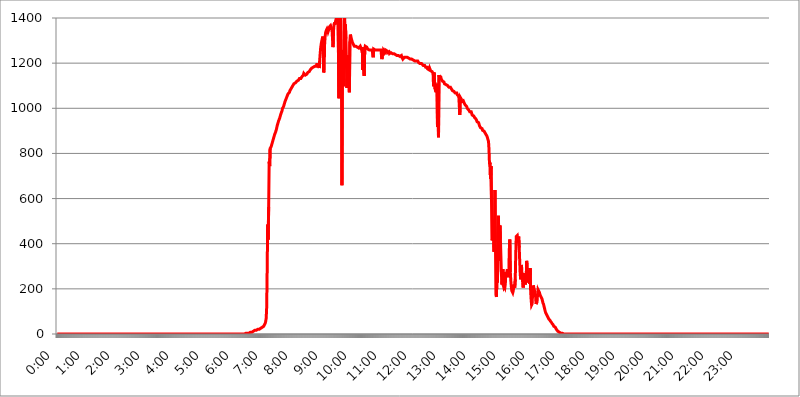
| Category | 2016.02.22. Intenzitás [W/m^2] |
|---|---|
| 0.0 | 0 |
| 0.0006944444444444445 | 0 |
| 0.001388888888888889 | 0 |
| 0.0020833333333333333 | 0 |
| 0.002777777777777778 | 0 |
| 0.003472222222222222 | 0 |
| 0.004166666666666667 | 0 |
| 0.004861111111111111 | 0 |
| 0.005555555555555556 | 0 |
| 0.0062499999999999995 | 0 |
| 0.006944444444444444 | 0 |
| 0.007638888888888889 | 0 |
| 0.008333333333333333 | 0 |
| 0.009027777777777779 | 0 |
| 0.009722222222222222 | 0 |
| 0.010416666666666666 | 0 |
| 0.011111111111111112 | 0 |
| 0.011805555555555555 | 0 |
| 0.012499999999999999 | 0 |
| 0.013194444444444444 | 0 |
| 0.013888888888888888 | 0 |
| 0.014583333333333332 | 0 |
| 0.015277777777777777 | 0 |
| 0.015972222222222224 | 0 |
| 0.016666666666666666 | 0 |
| 0.017361111111111112 | 0 |
| 0.018055555555555557 | 0 |
| 0.01875 | 0 |
| 0.019444444444444445 | 0 |
| 0.02013888888888889 | 0 |
| 0.020833333333333332 | 0 |
| 0.02152777777777778 | 0 |
| 0.022222222222222223 | 0 |
| 0.02291666666666667 | 0 |
| 0.02361111111111111 | 0 |
| 0.024305555555555556 | 0 |
| 0.024999999999999998 | 0 |
| 0.025694444444444447 | 0 |
| 0.02638888888888889 | 0 |
| 0.027083333333333334 | 0 |
| 0.027777777777777776 | 0 |
| 0.02847222222222222 | 0 |
| 0.029166666666666664 | 0 |
| 0.029861111111111113 | 0 |
| 0.030555555555555555 | 0 |
| 0.03125 | 0 |
| 0.03194444444444445 | 0 |
| 0.03263888888888889 | 0 |
| 0.03333333333333333 | 0 |
| 0.034027777777777775 | 0 |
| 0.034722222222222224 | 0 |
| 0.035416666666666666 | 0 |
| 0.036111111111111115 | 0 |
| 0.03680555555555556 | 0 |
| 0.0375 | 0 |
| 0.03819444444444444 | 0 |
| 0.03888888888888889 | 0 |
| 0.03958333333333333 | 0 |
| 0.04027777777777778 | 0 |
| 0.04097222222222222 | 0 |
| 0.041666666666666664 | 0 |
| 0.042361111111111106 | 0 |
| 0.04305555555555556 | 0 |
| 0.043750000000000004 | 0 |
| 0.044444444444444446 | 0 |
| 0.04513888888888889 | 0 |
| 0.04583333333333334 | 0 |
| 0.04652777777777778 | 0 |
| 0.04722222222222222 | 0 |
| 0.04791666666666666 | 0 |
| 0.04861111111111111 | 0 |
| 0.049305555555555554 | 0 |
| 0.049999999999999996 | 0 |
| 0.05069444444444445 | 0 |
| 0.051388888888888894 | 0 |
| 0.052083333333333336 | 0 |
| 0.05277777777777778 | 0 |
| 0.05347222222222222 | 0 |
| 0.05416666666666667 | 0 |
| 0.05486111111111111 | 0 |
| 0.05555555555555555 | 0 |
| 0.05625 | 0 |
| 0.05694444444444444 | 0 |
| 0.057638888888888885 | 0 |
| 0.05833333333333333 | 0 |
| 0.05902777777777778 | 0 |
| 0.059722222222222225 | 0 |
| 0.06041666666666667 | 0 |
| 0.061111111111111116 | 0 |
| 0.06180555555555556 | 0 |
| 0.0625 | 0 |
| 0.06319444444444444 | 0 |
| 0.06388888888888888 | 0 |
| 0.06458333333333334 | 0 |
| 0.06527777777777778 | 0 |
| 0.06597222222222222 | 0 |
| 0.06666666666666667 | 0 |
| 0.06736111111111111 | 0 |
| 0.06805555555555555 | 0 |
| 0.06874999999999999 | 0 |
| 0.06944444444444443 | 0 |
| 0.07013888888888889 | 0 |
| 0.07083333333333333 | 0 |
| 0.07152777777777779 | 0 |
| 0.07222222222222223 | 0 |
| 0.07291666666666667 | 0 |
| 0.07361111111111111 | 0 |
| 0.07430555555555556 | 0 |
| 0.075 | 0 |
| 0.07569444444444444 | 0 |
| 0.0763888888888889 | 0 |
| 0.07708333333333334 | 0 |
| 0.07777777777777778 | 0 |
| 0.07847222222222222 | 0 |
| 0.07916666666666666 | 0 |
| 0.0798611111111111 | 0 |
| 0.08055555555555556 | 0 |
| 0.08125 | 0 |
| 0.08194444444444444 | 0 |
| 0.08263888888888889 | 0 |
| 0.08333333333333333 | 0 |
| 0.08402777777777777 | 0 |
| 0.08472222222222221 | 0 |
| 0.08541666666666665 | 0 |
| 0.08611111111111112 | 0 |
| 0.08680555555555557 | 0 |
| 0.08750000000000001 | 0 |
| 0.08819444444444445 | 0 |
| 0.08888888888888889 | 0 |
| 0.08958333333333333 | 0 |
| 0.09027777777777778 | 0 |
| 0.09097222222222222 | 0 |
| 0.09166666666666667 | 0 |
| 0.09236111111111112 | 0 |
| 0.09305555555555556 | 0 |
| 0.09375 | 0 |
| 0.09444444444444444 | 0 |
| 0.09513888888888888 | 0 |
| 0.09583333333333333 | 0 |
| 0.09652777777777777 | 0 |
| 0.09722222222222222 | 0 |
| 0.09791666666666667 | 0 |
| 0.09861111111111111 | 0 |
| 0.09930555555555555 | 0 |
| 0.09999999999999999 | 0 |
| 0.10069444444444443 | 0 |
| 0.1013888888888889 | 0 |
| 0.10208333333333335 | 0 |
| 0.10277777777777779 | 0 |
| 0.10347222222222223 | 0 |
| 0.10416666666666667 | 0 |
| 0.10486111111111111 | 0 |
| 0.10555555555555556 | 0 |
| 0.10625 | 0 |
| 0.10694444444444444 | 0 |
| 0.1076388888888889 | 0 |
| 0.10833333333333334 | 0 |
| 0.10902777777777778 | 0 |
| 0.10972222222222222 | 0 |
| 0.1111111111111111 | 0 |
| 0.11180555555555556 | 0 |
| 0.11180555555555556 | 0 |
| 0.1125 | 0 |
| 0.11319444444444444 | 0 |
| 0.11388888888888889 | 0 |
| 0.11458333333333333 | 0 |
| 0.11527777777777777 | 0 |
| 0.11597222222222221 | 0 |
| 0.11666666666666665 | 0 |
| 0.1173611111111111 | 0 |
| 0.11805555555555557 | 0 |
| 0.11944444444444445 | 0 |
| 0.12013888888888889 | 0 |
| 0.12083333333333333 | 0 |
| 0.12152777777777778 | 0 |
| 0.12222222222222223 | 0 |
| 0.12291666666666667 | 0 |
| 0.12291666666666667 | 0 |
| 0.12361111111111112 | 0 |
| 0.12430555555555556 | 0 |
| 0.125 | 0 |
| 0.12569444444444444 | 0 |
| 0.12638888888888888 | 0 |
| 0.12708333333333333 | 0 |
| 0.16875 | 0 |
| 0.12847222222222224 | 0 |
| 0.12916666666666668 | 0 |
| 0.12986111111111112 | 0 |
| 0.13055555555555556 | 0 |
| 0.13125 | 0 |
| 0.13194444444444445 | 0 |
| 0.1326388888888889 | 0 |
| 0.13333333333333333 | 0 |
| 0.13402777777777777 | 0 |
| 0.13402777777777777 | 0 |
| 0.13472222222222222 | 0 |
| 0.13541666666666666 | 0 |
| 0.1361111111111111 | 0 |
| 0.13749999999999998 | 0 |
| 0.13819444444444443 | 0 |
| 0.1388888888888889 | 0 |
| 0.13958333333333334 | 0 |
| 0.14027777777777778 | 0 |
| 0.14097222222222222 | 0 |
| 0.14166666666666666 | 0 |
| 0.1423611111111111 | 0 |
| 0.14305555555555557 | 0 |
| 0.14375000000000002 | 0 |
| 0.14444444444444446 | 0 |
| 0.1451388888888889 | 0 |
| 0.1451388888888889 | 0 |
| 0.14652777777777778 | 0 |
| 0.14722222222222223 | 0 |
| 0.14791666666666667 | 0 |
| 0.1486111111111111 | 0 |
| 0.14930555555555555 | 0 |
| 0.15 | 0 |
| 0.15069444444444444 | 0 |
| 0.15138888888888888 | 0 |
| 0.15208333333333332 | 0 |
| 0.15277777777777776 | 0 |
| 0.15347222222222223 | 0 |
| 0.15416666666666667 | 0 |
| 0.15486111111111112 | 0 |
| 0.15555555555555556 | 0 |
| 0.15625 | 0 |
| 0.15694444444444444 | 0 |
| 0.15763888888888888 | 0 |
| 0.15833333333333333 | 0 |
| 0.15902777777777777 | 0 |
| 0.15972222222222224 | 0 |
| 0.16041666666666668 | 0 |
| 0.16111111111111112 | 0 |
| 0.16180555555555556 | 0 |
| 0.1625 | 0 |
| 0.16319444444444445 | 0 |
| 0.1638888888888889 | 0 |
| 0.16458333333333333 | 0 |
| 0.16527777777777777 | 0 |
| 0.16597222222222222 | 0 |
| 0.16666666666666666 | 0 |
| 0.1673611111111111 | 0 |
| 0.16805555555555554 | 0 |
| 0.16874999999999998 | 0 |
| 0.16944444444444443 | 0 |
| 0.17013888888888887 | 0 |
| 0.1708333333333333 | 0 |
| 0.17152777777777775 | 0 |
| 0.17222222222222225 | 0 |
| 0.1729166666666667 | 0 |
| 0.17361111111111113 | 0 |
| 0.17430555555555557 | 0 |
| 0.17500000000000002 | 0 |
| 0.17569444444444446 | 0 |
| 0.1763888888888889 | 0 |
| 0.17708333333333334 | 0 |
| 0.17777777777777778 | 0 |
| 0.17847222222222223 | 0 |
| 0.17916666666666667 | 0 |
| 0.1798611111111111 | 0 |
| 0.18055555555555555 | 0 |
| 0.18125 | 0 |
| 0.18194444444444444 | 0 |
| 0.1826388888888889 | 0 |
| 0.18333333333333335 | 0 |
| 0.1840277777777778 | 0 |
| 0.18472222222222223 | 0 |
| 0.18541666666666667 | 0 |
| 0.18611111111111112 | 0 |
| 0.18680555555555556 | 0 |
| 0.1875 | 0 |
| 0.18819444444444444 | 0 |
| 0.18888888888888888 | 0 |
| 0.18958333333333333 | 0 |
| 0.19027777777777777 | 0 |
| 0.1909722222222222 | 0 |
| 0.19166666666666665 | 0 |
| 0.19236111111111112 | 0 |
| 0.19305555555555554 | 0 |
| 0.19375 | 0 |
| 0.19444444444444445 | 0 |
| 0.1951388888888889 | 0 |
| 0.19583333333333333 | 0 |
| 0.19652777777777777 | 0 |
| 0.19722222222222222 | 0 |
| 0.19791666666666666 | 0 |
| 0.1986111111111111 | 0 |
| 0.19930555555555554 | 0 |
| 0.19999999999999998 | 0 |
| 0.20069444444444443 | 0 |
| 0.20138888888888887 | 0 |
| 0.2020833333333333 | 0 |
| 0.2027777777777778 | 0 |
| 0.2034722222222222 | 0 |
| 0.2041666666666667 | 0 |
| 0.20486111111111113 | 0 |
| 0.20555555555555557 | 0 |
| 0.20625000000000002 | 0 |
| 0.20694444444444446 | 0 |
| 0.2076388888888889 | 0 |
| 0.20833333333333334 | 0 |
| 0.20902777777777778 | 0 |
| 0.20972222222222223 | 0 |
| 0.21041666666666667 | 0 |
| 0.2111111111111111 | 0 |
| 0.21180555555555555 | 0 |
| 0.2125 | 0 |
| 0.21319444444444444 | 0 |
| 0.2138888888888889 | 0 |
| 0.21458333333333335 | 0 |
| 0.2152777777777778 | 0 |
| 0.21597222222222223 | 0 |
| 0.21666666666666667 | 0 |
| 0.21736111111111112 | 0 |
| 0.21805555555555556 | 0 |
| 0.21875 | 0 |
| 0.21944444444444444 | 0 |
| 0.22013888888888888 | 0 |
| 0.22083333333333333 | 0 |
| 0.22152777777777777 | 0 |
| 0.2222222222222222 | 0 |
| 0.22291666666666665 | 0 |
| 0.2236111111111111 | 0 |
| 0.22430555555555556 | 0 |
| 0.225 | 0 |
| 0.22569444444444445 | 0 |
| 0.2263888888888889 | 0 |
| 0.22708333333333333 | 0 |
| 0.22777777777777777 | 0 |
| 0.22847222222222222 | 0 |
| 0.22916666666666666 | 0 |
| 0.2298611111111111 | 0 |
| 0.23055555555555554 | 0 |
| 0.23124999999999998 | 0 |
| 0.23194444444444443 | 0 |
| 0.23263888888888887 | 0 |
| 0.2333333333333333 | 0 |
| 0.2340277777777778 | 0 |
| 0.2347222222222222 | 0 |
| 0.2354166666666667 | 0 |
| 0.23611111111111113 | 0 |
| 0.23680555555555557 | 0 |
| 0.23750000000000002 | 0 |
| 0.23819444444444446 | 0 |
| 0.2388888888888889 | 0 |
| 0.23958333333333334 | 0 |
| 0.24027777777777778 | 0 |
| 0.24097222222222223 | 0 |
| 0.24166666666666667 | 0 |
| 0.2423611111111111 | 0 |
| 0.24305555555555555 | 0 |
| 0.24375 | 0 |
| 0.24444444444444446 | 0 |
| 0.24513888888888888 | 0 |
| 0.24583333333333335 | 0 |
| 0.2465277777777778 | 0 |
| 0.24722222222222223 | 0 |
| 0.24791666666666667 | 0 |
| 0.24861111111111112 | 0 |
| 0.24930555555555556 | 0 |
| 0.25 | 0 |
| 0.25069444444444444 | 0 |
| 0.2513888888888889 | 0 |
| 0.2520833333333333 | 0 |
| 0.25277777777777777 | 0 |
| 0.2534722222222222 | 0 |
| 0.25416666666666665 | 0 |
| 0.2548611111111111 | 0 |
| 0.2555555555555556 | 0 |
| 0.25625000000000003 | 0 |
| 0.2569444444444445 | 0 |
| 0.2576388888888889 | 3.525 |
| 0.25833333333333336 | 0 |
| 0.2590277777777778 | 0 |
| 0.25972222222222224 | 0 |
| 0.2604166666666667 | 0 |
| 0.2611111111111111 | 0 |
| 0.26180555555555557 | 0 |
| 0.2625 | 0 |
| 0.26319444444444445 | 0 |
| 0.2638888888888889 | 0 |
| 0.26458333333333334 | 3.525 |
| 0.2652777777777778 | 0 |
| 0.2659722222222222 | 3.525 |
| 0.26666666666666666 | 3.525 |
| 0.2673611111111111 | 3.525 |
| 0.26805555555555555 | 3.525 |
| 0.26875 | 3.525 |
| 0.26944444444444443 | 3.525 |
| 0.2701388888888889 | 7.887 |
| 0.2708333333333333 | 7.887 |
| 0.27152777777777776 | 7.887 |
| 0.2722222222222222 | 7.887 |
| 0.27291666666666664 | 7.887 |
| 0.2736111111111111 | 12.257 |
| 0.2743055555555555 | 12.257 |
| 0.27499999999999997 | 12.257 |
| 0.27569444444444446 | 12.257 |
| 0.27638888888888885 | 12.257 |
| 0.27708333333333335 | 16.636 |
| 0.2777777777777778 | 16.636 |
| 0.27847222222222223 | 16.636 |
| 0.2791666666666667 | 16.636 |
| 0.2798611111111111 | 16.636 |
| 0.28055555555555556 | 16.636 |
| 0.28125 | 21.024 |
| 0.28194444444444444 | 21.024 |
| 0.2826388888888889 | 21.024 |
| 0.2833333333333333 | 21.024 |
| 0.28402777777777777 | 21.024 |
| 0.2847222222222222 | 21.024 |
| 0.28541666666666665 | 25.419 |
| 0.28611111111111115 | 25.419 |
| 0.28680555555555554 | 25.419 |
| 0.28750000000000003 | 29.823 |
| 0.2881944444444445 | 29.823 |
| 0.2888888888888889 | 29.823 |
| 0.28958333333333336 | 34.234 |
| 0.2902777777777778 | 34.234 |
| 0.29097222222222224 | 38.653 |
| 0.2916666666666667 | 47.511 |
| 0.2923611111111111 | 56.398 |
| 0.29305555555555557 | 69.775 |
| 0.29375 | 119.235 |
| 0.29444444444444445 | 287.709 |
| 0.2951388888888889 | 484.735 |
| 0.29583333333333334 | 418.492 |
| 0.2965277777777778 | 562.53 |
| 0.2972222222222222 | 763.674 |
| 0.29791666666666666 | 743.859 |
| 0.2986111111111111 | 822.26 |
| 0.29930555555555555 | 826.123 |
| 0.3 | 829.981 |
| 0.30069444444444443 | 837.682 |
| 0.3013888888888889 | 841.526 |
| 0.3020833333333333 | 837.682 |
| 0.30277777777777776 | 860.676 |
| 0.3034722222222222 | 864.493 |
| 0.30416666666666664 | 875.918 |
| 0.3048611111111111 | 883.516 |
| 0.3055555555555555 | 887.309 |
| 0.30624999999999997 | 894.885 |
| 0.3069444444444444 | 898.668 |
| 0.3076388888888889 | 909.996 |
| 0.30833333333333335 | 921.298 |
| 0.3090277777777778 | 928.819 |
| 0.30972222222222223 | 932.576 |
| 0.3104166666666667 | 943.832 |
| 0.3111111111111111 | 947.58 |
| 0.31180555555555556 | 955.071 |
| 0.3125 | 962.555 |
| 0.31319444444444444 | 970.034 |
| 0.3138888888888889 | 977.508 |
| 0.3145833333333333 | 981.244 |
| 0.31527777777777777 | 988.714 |
| 0.3159722222222222 | 999.916 |
| 0.31666666666666665 | 999.916 |
| 0.31736111111111115 | 1007.383 |
| 0.31805555555555554 | 1014.852 |
| 0.31875000000000003 | 1022.323 |
| 0.3194444444444445 | 1029.798 |
| 0.3201388888888889 | 1033.537 |
| 0.32083333333333336 | 1041.019 |
| 0.3215277777777778 | 1044.762 |
| 0.32222222222222224 | 1052.255 |
| 0.3229166666666667 | 1052.255 |
| 0.3236111111111111 | 1063.51 |
| 0.32430555555555557 | 1067.267 |
| 0.325 | 1067.267 |
| 0.32569444444444445 | 1071.027 |
| 0.3263888888888889 | 1078.555 |
| 0.32708333333333334 | 1082.324 |
| 0.3277777777777778 | 1086.097 |
| 0.3284722222222222 | 1089.873 |
| 0.32916666666666666 | 1093.653 |
| 0.3298611111111111 | 1097.437 |
| 0.33055555555555555 | 1101.226 |
| 0.33125 | 1101.226 |
| 0.33194444444444443 | 1108.816 |
| 0.3326388888888889 | 1108.816 |
| 0.3333333333333333 | 1112.618 |
| 0.3340277777777778 | 1112.618 |
| 0.3347222222222222 | 1116.426 |
| 0.3354166666666667 | 1116.426 |
| 0.3361111111111111 | 1120.238 |
| 0.3368055555555556 | 1120.238 |
| 0.33749999999999997 | 1120.238 |
| 0.33819444444444446 | 1124.056 |
| 0.33888888888888885 | 1124.056 |
| 0.33958333333333335 | 1131.708 |
| 0.34027777777777773 | 1131.708 |
| 0.34097222222222223 | 1131.708 |
| 0.3416666666666666 | 1131.708 |
| 0.3423611111111111 | 1135.543 |
| 0.3430555555555555 | 1139.384 |
| 0.34375 | 1135.543 |
| 0.3444444444444445 | 1143.232 |
| 0.3451388888888889 | 1147.086 |
| 0.3458333333333334 | 1154.814 |
| 0.34652777777777777 | 1154.814 |
| 0.34722222222222227 | 1150.946 |
| 0.34791666666666665 | 1147.086 |
| 0.34861111111111115 | 1147.086 |
| 0.34930555555555554 | 1150.946 |
| 0.35000000000000003 | 1150.946 |
| 0.3506944444444444 | 1154.814 |
| 0.3513888888888889 | 1158.689 |
| 0.3520833333333333 | 1158.689 |
| 0.3527777777777778 | 1162.571 |
| 0.3534722222222222 | 1162.571 |
| 0.3541666666666667 | 1166.46 |
| 0.3548611111111111 | 1170.358 |
| 0.35555555555555557 | 1170.358 |
| 0.35625 | 1174.263 |
| 0.35694444444444445 | 1178.177 |
| 0.3576388888888889 | 1182.099 |
| 0.35833333333333334 | 1178.177 |
| 0.3590277777777778 | 1182.099 |
| 0.3597222222222222 | 1182.099 |
| 0.36041666666666666 | 1182.099 |
| 0.3611111111111111 | 1186.03 |
| 0.36180555555555555 | 1186.03 |
| 0.3625 | 1186.03 |
| 0.36319444444444443 | 1186.03 |
| 0.3638888888888889 | 1193.918 |
| 0.3645833333333333 | 1193.918 |
| 0.3652777777777778 | 1193.918 |
| 0.3659722222222222 | 1193.918 |
| 0.3666666666666667 | 1193.918 |
| 0.3673611111111111 | 1178.177 |
| 0.3680555555555556 | 1209.807 |
| 0.36874999999999997 | 1242.089 |
| 0.36944444444444446 | 1266.8 |
| 0.37013888888888885 | 1283.541 |
| 0.37083333333333335 | 1296.248 |
| 0.37152777777777773 | 1304.795 |
| 0.37222222222222223 | 1317.736 |
| 0.3729166666666666 | 1300.514 |
| 0.3736111111111111 | 1158.689 |
| 0.3743055555555555 | 1166.46 |
| 0.375 | 1283.541 |
| 0.3756944444444445 | 1317.736 |
| 0.3763888888888889 | 1335.223 |
| 0.3770833333333334 | 1339.639 |
| 0.37777777777777777 | 1348.524 |
| 0.37847222222222227 | 1352.994 |
| 0.37916666666666665 | 1348.524 |
| 0.37986111111111115 | 1339.639 |
| 0.38055555555555554 | 1339.639 |
| 0.38125000000000003 | 1352.994 |
| 0.3819444444444444 | 1361.991 |
| 0.3826388888888889 | 1361.991 |
| 0.3833333333333333 | 1366.519 |
| 0.3840277777777778 | 1366.519 |
| 0.3847222222222222 | 1352.994 |
| 0.3854166666666667 | 1344.072 |
| 0.3861111111111111 | 1304.795 |
| 0.38680555555555557 | 1270.964 |
| 0.3875 | 1344.072 |
| 0.38819444444444445 | 1371.066 |
| 0.3888888888888889 | 1380.22 |
| 0.38958333333333334 | 1371.066 |
| 0.3902777777777778 | 1384.828 |
| 0.3909722222222222 | 1394.106 |
| 0.39166666666666666 | 1403.469 |
| 0.3923611111111111 | 1389.456 |
| 0.39305555555555555 | 1408.184 |
| 0.39375 | 1436.949 |
| 0.39444444444444443 | 1436.949 |
| 0.3951388888888889 | 1044.762 |
| 0.3958333333333333 | 1432.097 |
| 0.3965277777777778 | 1291.997 |
| 0.3972222222222222 | 1481.743 |
| 0.3979166666666667 | 1205.82 |
| 0.3986111111111111 | 1139.384 |
| 0.3993055555555556 | 658.909 |
| 0.39999999999999997 | 1258.511 |
| 0.40069444444444446 | 1246.176 |
| 0.40138888888888885 | 1154.814 |
| 0.40208333333333335 | 1097.437 |
| 0.40277777777777773 | 1446.727 |
| 0.40347222222222223 | 1309.093 |
| 0.4041666666666666 | 1371.066 |
| 0.4048611111111111 | 1309.093 |
| 0.4055555555555555 | 1309.093 |
| 0.40625 | 1089.873 |
| 0.4069444444444445 | 1182.099 |
| 0.4076388888888889 | 1233.951 |
| 0.4083333333333334 | 1174.263 |
| 0.40902777777777777 | 1233.951 |
| 0.40972222222222227 | 1071.027 |
| 0.41041666666666665 | 1296.248 |
| 0.41111111111111115 | 1326.445 |
| 0.41180555555555554 | 1317.736 |
| 0.41250000000000003 | 1309.093 |
| 0.4131944444444444 | 1300.514 |
| 0.4138888888888889 | 1291.997 |
| 0.4145833333333333 | 1287.761 |
| 0.4152777777777778 | 1283.541 |
| 0.4159722222222222 | 1279.334 |
| 0.4166666666666667 | 1275.142 |
| 0.4173611111111111 | 1275.142 |
| 0.41805555555555557 | 1275.142 |
| 0.41875 | 1275.142 |
| 0.41944444444444445 | 1275.142 |
| 0.4201388888888889 | 1270.964 |
| 0.42083333333333334 | 1270.964 |
| 0.4215277777777778 | 1270.964 |
| 0.4222222222222222 | 1270.964 |
| 0.42291666666666666 | 1266.8 |
| 0.4236111111111111 | 1270.964 |
| 0.42430555555555555 | 1270.964 |
| 0.425 | 1275.142 |
| 0.42569444444444443 | 1275.142 |
| 0.4263888888888889 | 1270.964 |
| 0.4270833333333333 | 1258.511 |
| 0.4277777777777778 | 1270.964 |
| 0.4284722222222222 | 1170.358 |
| 0.4291666666666667 | 1209.807 |
| 0.4298611111111111 | 1205.82 |
| 0.4305555555555556 | 1143.232 |
| 0.43124999999999997 | 1262.649 |
| 0.43194444444444446 | 1275.142 |
| 0.43263888888888885 | 1275.142 |
| 0.43333333333333335 | 1279.334 |
| 0.43402777777777773 | 1270.964 |
| 0.43472222222222223 | 1266.8 |
| 0.4354166666666666 | 1262.649 |
| 0.4361111111111111 | 1258.511 |
| 0.4368055555555555 | 1258.511 |
| 0.4375 | 1258.511 |
| 0.4381944444444445 | 1254.387 |
| 0.4388888888888889 | 1258.511 |
| 0.4395833333333334 | 1258.511 |
| 0.44027777777777777 | 1258.511 |
| 0.44097222222222227 | 1258.511 |
| 0.44166666666666665 | 1258.511 |
| 0.44236111111111115 | 1258.511 |
| 0.44305555555555554 | 1225.859 |
| 0.44375000000000003 | 1262.649 |
| 0.4444444444444444 | 1258.511 |
| 0.4451388888888889 | 1258.511 |
| 0.4458333333333333 | 1258.511 |
| 0.4465277777777778 | 1258.511 |
| 0.4472222222222222 | 1258.511 |
| 0.4479166666666667 | 1258.511 |
| 0.4486111111111111 | 1258.511 |
| 0.44930555555555557 | 1258.511 |
| 0.45 | 1258.511 |
| 0.45069444444444445 | 1258.511 |
| 0.4513888888888889 | 1258.511 |
| 0.45208333333333334 | 1258.511 |
| 0.4527777777777778 | 1262.649 |
| 0.4534722222222222 | 1258.511 |
| 0.45416666666666666 | 1258.511 |
| 0.4548611111111111 | 1225.859 |
| 0.45555555555555555 | 1217.812 |
| 0.45625 | 1250.275 |
| 0.45694444444444443 | 1233.951 |
| 0.4576388888888889 | 1258.511 |
| 0.4583333333333333 | 1258.511 |
| 0.4590277777777778 | 1258.511 |
| 0.4597222222222222 | 1250.275 |
| 0.4604166666666667 | 1258.511 |
| 0.4611111111111111 | 1254.387 |
| 0.4618055555555556 | 1254.387 |
| 0.46249999999999997 | 1254.387 |
| 0.46319444444444446 | 1246.176 |
| 0.46388888888888885 | 1246.176 |
| 0.46458333333333335 | 1246.176 |
| 0.46527777777777773 | 1250.275 |
| 0.46597222222222223 | 1242.089 |
| 0.4666666666666666 | 1242.089 |
| 0.4673611111111111 | 1246.176 |
| 0.4680555555555555 | 1246.176 |
| 0.46875 | 1242.089 |
| 0.4694444444444445 | 1242.089 |
| 0.4701388888888889 | 1242.089 |
| 0.4708333333333334 | 1242.089 |
| 0.47152777777777777 | 1242.089 |
| 0.47222222222222227 | 1242.089 |
| 0.47291666666666665 | 1238.014 |
| 0.47361111111111115 | 1238.014 |
| 0.47430555555555554 | 1238.014 |
| 0.47500000000000003 | 1238.014 |
| 0.4756944444444444 | 1233.951 |
| 0.4763888888888889 | 1233.951 |
| 0.4770833333333333 | 1233.951 |
| 0.4777777777777778 | 1233.951 |
| 0.4784722222222222 | 1233.951 |
| 0.4791666666666667 | 1233.951 |
| 0.4798611111111111 | 1233.951 |
| 0.48055555555555557 | 1229.899 |
| 0.48125 | 1229.899 |
| 0.48194444444444445 | 1229.899 |
| 0.4826388888888889 | 1233.951 |
| 0.48333333333333334 | 1225.859 |
| 0.4840277777777778 | 1225.859 |
| 0.4847222222222222 | 1217.812 |
| 0.48541666666666666 | 1221.83 |
| 0.4861111111111111 | 1217.812 |
| 0.48680555555555555 | 1225.859 |
| 0.4875 | 1225.859 |
| 0.48819444444444443 | 1221.83 |
| 0.4888888888888889 | 1225.859 |
| 0.4895833333333333 | 1225.859 |
| 0.4902777777777778 | 1225.859 |
| 0.4909722222222222 | 1225.859 |
| 0.4916666666666667 | 1221.83 |
| 0.4923611111111111 | 1221.83 |
| 0.4930555555555556 | 1221.83 |
| 0.49374999999999997 | 1221.83 |
| 0.49444444444444446 | 1221.83 |
| 0.49513888888888885 | 1217.812 |
| 0.49583333333333335 | 1217.812 |
| 0.49652777777777773 | 1217.812 |
| 0.49722222222222223 | 1217.812 |
| 0.4979166666666666 | 1217.812 |
| 0.4986111111111111 | 1213.804 |
| 0.4993055555555555 | 1213.804 |
| 0.5 | 1213.804 |
| 0.5006944444444444 | 1213.804 |
| 0.5013888888888889 | 1209.807 |
| 0.5020833333333333 | 1209.807 |
| 0.5027777777777778 | 1209.807 |
| 0.5034722222222222 | 1209.807 |
| 0.5041666666666667 | 1209.807 |
| 0.5048611111111111 | 1209.807 |
| 0.5055555555555555 | 1209.807 |
| 0.50625 | 1205.82 |
| 0.5069444444444444 | 1201.843 |
| 0.5076388888888889 | 1201.843 |
| 0.5083333333333333 | 1201.843 |
| 0.5090277777777777 | 1197.876 |
| 0.5097222222222222 | 1197.876 |
| 0.5104166666666666 | 1193.918 |
| 0.5111111111111112 | 1197.876 |
| 0.5118055555555555 | 1197.876 |
| 0.5125000000000001 | 1193.918 |
| 0.5131944444444444 | 1189.969 |
| 0.513888888888889 | 1193.918 |
| 0.5145833333333333 | 1189.969 |
| 0.5152777777777778 | 1189.969 |
| 0.5159722222222222 | 1186.03 |
| 0.5166666666666667 | 1182.099 |
| 0.517361111111111 | 1178.177 |
| 0.5180555555555556 | 1186.03 |
| 0.5187499999999999 | 1182.099 |
| 0.5194444444444445 | 1174.263 |
| 0.5201388888888888 | 1174.263 |
| 0.5208333333333334 | 1174.263 |
| 0.5215277777777778 | 1170.358 |
| 0.5222222222222223 | 1178.177 |
| 0.5229166666666667 | 1174.263 |
| 0.5236111111111111 | 1166.46 |
| 0.5243055555555556 | 1170.358 |
| 0.525 | 1170.358 |
| 0.5256944444444445 | 1162.571 |
| 0.5263888888888889 | 1166.46 |
| 0.5270833333333333 | 1154.814 |
| 0.5277777777777778 | 1097.437 |
| 0.5284722222222222 | 1158.689 |
| 0.5291666666666667 | 1158.689 |
| 0.5298611111111111 | 1086.097 |
| 0.5305555555555556 | 1078.555 |
| 0.53125 | 1071.027 |
| 0.5319444444444444 | 1074.789 |
| 0.5326388888888889 | 1108.816 |
| 0.5333333333333333 | 917.534 |
| 0.5340277777777778 | 1014.852 |
| 0.5347222222222222 | 872.114 |
| 0.5354166666666667 | 1147.086 |
| 0.5361111111111111 | 1150.946 |
| 0.5368055555555555 | 1127.879 |
| 0.5375 | 1143.232 |
| 0.5381944444444444 | 1131.708 |
| 0.5388888888888889 | 1127.879 |
| 0.5395833333333333 | 1127.879 |
| 0.5402777777777777 | 1120.238 |
| 0.5409722222222222 | 1120.238 |
| 0.5416666666666666 | 1116.426 |
| 0.5423611111111112 | 1116.426 |
| 0.5430555555555555 | 1108.816 |
| 0.5437500000000001 | 1108.816 |
| 0.5444444444444444 | 1112.618 |
| 0.545138888888889 | 1105.019 |
| 0.5458333333333333 | 1108.816 |
| 0.5465277777777778 | 1101.226 |
| 0.5472222222222222 | 1101.226 |
| 0.5479166666666667 | 1101.226 |
| 0.548611111111111 | 1097.437 |
| 0.5493055555555556 | 1093.653 |
| 0.5499999999999999 | 1089.873 |
| 0.5506944444444445 | 1093.653 |
| 0.5513888888888888 | 1093.653 |
| 0.5520833333333334 | 1089.873 |
| 0.5527777777777778 | 1086.097 |
| 0.5534722222222223 | 1082.324 |
| 0.5541666666666667 | 1078.555 |
| 0.5548611111111111 | 1078.555 |
| 0.5555555555555556 | 1078.555 |
| 0.55625 | 1074.789 |
| 0.5569444444444445 | 1074.789 |
| 0.5576388888888889 | 1074.789 |
| 0.5583333333333333 | 1067.267 |
| 0.5590277777777778 | 1067.267 |
| 0.5597222222222222 | 1063.51 |
| 0.5604166666666667 | 1067.267 |
| 0.5611111111111111 | 1059.756 |
| 0.5618055555555556 | 1059.756 |
| 0.5625 | 1059.756 |
| 0.5631944444444444 | 1052.255 |
| 0.5638888888888889 | 1052.255 |
| 0.5645833333333333 | 970.034 |
| 0.5652777777777778 | 1048.508 |
| 0.5659722222222222 | 1052.255 |
| 0.5666666666666667 | 1041.019 |
| 0.5673611111111111 | 1029.798 |
| 0.5680555555555555 | 1033.537 |
| 0.56875 | 1029.798 |
| 0.5694444444444444 | 1033.537 |
| 0.5701388888888889 | 1029.798 |
| 0.5708333333333333 | 1022.323 |
| 0.5715277777777777 | 1018.587 |
| 0.5722222222222222 | 1014.852 |
| 0.5729166666666666 | 1011.118 |
| 0.5736111111111112 | 1011.118 |
| 0.5743055555555555 | 1007.383 |
| 0.5750000000000001 | 999.916 |
| 0.5756944444444444 | 999.916 |
| 0.576388888888889 | 996.182 |
| 0.5770833333333333 | 992.448 |
| 0.5777777777777778 | 992.448 |
| 0.5784722222222222 | 984.98 |
| 0.5791666666666667 | 988.714 |
| 0.579861111111111 | 988.714 |
| 0.5805555555555556 | 984.98 |
| 0.5812499999999999 | 977.508 |
| 0.5819444444444445 | 970.034 |
| 0.5826388888888888 | 970.034 |
| 0.5833333333333334 | 970.034 |
| 0.5840277777777778 | 966.295 |
| 0.5847222222222223 | 962.555 |
| 0.5854166666666667 | 958.814 |
| 0.5861111111111111 | 958.814 |
| 0.5868055555555556 | 955.071 |
| 0.5875 | 951.327 |
| 0.5881944444444445 | 947.58 |
| 0.5888888888888889 | 940.082 |
| 0.5895833333333333 | 940.082 |
| 0.5902777777777778 | 936.33 |
| 0.5909722222222222 | 936.33 |
| 0.5916666666666667 | 932.576 |
| 0.5923611111111111 | 921.298 |
| 0.5930555555555556 | 917.534 |
| 0.59375 | 913.766 |
| 0.5944444444444444 | 909.996 |
| 0.5951388888888889 | 909.996 |
| 0.5958333333333333 | 909.996 |
| 0.5965277777777778 | 902.447 |
| 0.5972222222222222 | 898.668 |
| 0.5979166666666667 | 902.447 |
| 0.5986111111111111 | 898.668 |
| 0.5993055555555555 | 894.885 |
| 0.6 | 891.099 |
| 0.6006944444444444 | 887.309 |
| 0.6013888888888889 | 883.516 |
| 0.6020833333333333 | 879.719 |
| 0.6027777777777777 | 875.918 |
| 0.6034722222222222 | 868.305 |
| 0.6041666666666666 | 860.676 |
| 0.6048611111111112 | 853.029 |
| 0.6055555555555555 | 818.392 |
| 0.6062500000000001 | 751.803 |
| 0.6069444444444444 | 759.723 |
| 0.607638888888889 | 687.544 |
| 0.6083333333333333 | 743.859 |
| 0.6090277777777778 | 596.45 |
| 0.6097222222222222 | 414.035 |
| 0.6104166666666667 | 418.492 |
| 0.611111111111111 | 506.542 |
| 0.6118055555555556 | 480.356 |
| 0.6124999999999999 | 364.728 |
| 0.6131944444444445 | 484.735 |
| 0.6138888888888888 | 638.256 |
| 0.6145833333333334 | 405.108 |
| 0.6152777777777778 | 173.709 |
| 0.6159722222222223 | 164.605 |
| 0.6166666666666667 | 251.251 |
| 0.6173611111111111 | 228.436 |
| 0.6180555555555556 | 342.162 |
| 0.61875 | 523.88 |
| 0.6194444444444445 | 378.224 |
| 0.6201388888888889 | 324.052 |
| 0.6208333333333333 | 480.356 |
| 0.6215277777777778 | 422.943 |
| 0.6222222222222222 | 346.682 |
| 0.6229166666666667 | 269.49 |
| 0.6236111111111111 | 219.309 |
| 0.6243055555555556 | 246.689 |
| 0.625 | 287.709 |
| 0.6256944444444444 | 214.746 |
| 0.6263888888888889 | 205.62 |
| 0.6270833333333333 | 210.182 |
| 0.6277777777777778 | 205.62 |
| 0.6284722222222222 | 223.873 |
| 0.6291666666666667 | 274.047 |
| 0.6298611111111111 | 264.932 |
| 0.6305555555555555 | 274.047 |
| 0.63125 | 287.709 |
| 0.6319444444444444 | 278.603 |
| 0.6326388888888889 | 251.251 |
| 0.6333333333333333 | 269.49 |
| 0.6340277777777777 | 373.729 |
| 0.6347222222222222 | 418.492 |
| 0.6354166666666666 | 274.047 |
| 0.6361111111111112 | 237.564 |
| 0.6368055555555555 | 210.182 |
| 0.6375000000000001 | 191.937 |
| 0.6381944444444444 | 187.378 |
| 0.638888888888889 | 182.82 |
| 0.6395833333333333 | 191.937 |
| 0.6402777777777778 | 210.182 |
| 0.6409722222222222 | 219.309 |
| 0.6416666666666667 | 205.62 |
| 0.642361111111111 | 242.127 |
| 0.6430555555555556 | 351.198 |
| 0.6437499999999999 | 431.833 |
| 0.6444444444444445 | 431.833 |
| 0.6451388888888888 | 436.27 |
| 0.6458333333333334 | 405.108 |
| 0.6465277777777778 | 414.035 |
| 0.6472222222222223 | 431.833 |
| 0.6479166666666667 | 382.715 |
| 0.6486111111111111 | 324.052 |
| 0.6493055555555556 | 264.932 |
| 0.65 | 242.127 |
| 0.6506944444444445 | 305.898 |
| 0.6513888888888889 | 292.259 |
| 0.6520833333333333 | 246.689 |
| 0.6527777777777778 | 228.436 |
| 0.6534722222222222 | 205.62 |
| 0.6541666666666667 | 251.251 |
| 0.6548611111111111 | 269.49 |
| 0.6555555555555556 | 246.689 |
| 0.65625 | 219.309 |
| 0.6569444444444444 | 228.436 |
| 0.6576388888888889 | 237.564 |
| 0.6583333333333333 | 324.052 |
| 0.6590277777777778 | 305.898 |
| 0.6597222222222222 | 260.373 |
| 0.6604166666666667 | 228.436 |
| 0.6611111111111111 | 260.373 |
| 0.6618055555555555 | 278.603 |
| 0.6625 | 223.873 |
| 0.6631944444444444 | 292.259 |
| 0.6638888888888889 | 196.497 |
| 0.6645833333333333 | 155.509 |
| 0.6652777777777777 | 128.284 |
| 0.6659722222222222 | 132.814 |
| 0.6666666666666666 | 173.709 |
| 0.6673611111111111 | 214.746 |
| 0.6680555555555556 | 210.182 |
| 0.6687500000000001 | 201.058 |
| 0.6694444444444444 | 191.937 |
| 0.6701388888888888 | 173.709 |
| 0.6708333333333334 | 169.156 |
| 0.6715277777777778 | 132.814 |
| 0.6722222222222222 | 137.347 |
| 0.6729166666666666 | 141.884 |
| 0.6736111111111112 | 173.709 |
| 0.6743055555555556 | 196.497 |
| 0.6749999999999999 | 191.937 |
| 0.6756944444444444 | 187.378 |
| 0.6763888888888889 | 182.82 |
| 0.6770833333333334 | 173.709 |
| 0.6777777777777777 | 173.709 |
| 0.6784722222222223 | 164.605 |
| 0.6791666666666667 | 164.605 |
| 0.6798611111111111 | 155.509 |
| 0.6805555555555555 | 146.423 |
| 0.68125 | 137.347 |
| 0.6819444444444445 | 132.814 |
| 0.6826388888888889 | 123.758 |
| 0.6833333333333332 | 114.716 |
| 0.6840277777777778 | 105.69 |
| 0.6847222222222222 | 96.682 |
| 0.6854166666666667 | 92.184 |
| 0.686111111111111 | 87.692 |
| 0.6868055555555556 | 83.205 |
| 0.6875 | 83.205 |
| 0.6881944444444444 | 74.246 |
| 0.688888888888889 | 74.246 |
| 0.6895833333333333 | 65.31 |
| 0.6902777777777778 | 65.31 |
| 0.6909722222222222 | 60.85 |
| 0.6916666666666668 | 56.398 |
| 0.6923611111111111 | 56.398 |
| 0.6930555555555555 | 51.951 |
| 0.69375 | 47.511 |
| 0.6944444444444445 | 47.511 |
| 0.6951388888888889 | 43.079 |
| 0.6958333333333333 | 38.653 |
| 0.6965277777777777 | 34.234 |
| 0.6972222222222223 | 34.234 |
| 0.6979166666666666 | 29.823 |
| 0.6986111111111111 | 29.823 |
| 0.6993055555555556 | 25.419 |
| 0.7000000000000001 | 21.024 |
| 0.7006944444444444 | 21.024 |
| 0.7013888888888888 | 16.636 |
| 0.7020833333333334 | 12.257 |
| 0.7027777777777778 | 12.257 |
| 0.7034722222222222 | 7.887 |
| 0.7041666666666666 | 7.887 |
| 0.7048611111111112 | 3.525 |
| 0.7055555555555556 | 3.525 |
| 0.7062499999999999 | 3.525 |
| 0.7069444444444444 | 3.525 |
| 0.7076388888888889 | 3.525 |
| 0.7083333333333334 | 3.525 |
| 0.7090277777777777 | 3.525 |
| 0.7097222222222223 | 0 |
| 0.7104166666666667 | 0 |
| 0.7111111111111111 | 0 |
| 0.7118055555555555 | 0 |
| 0.7125 | 0 |
| 0.7131944444444445 | 0 |
| 0.7138888888888889 | 0 |
| 0.7145833333333332 | 0 |
| 0.7152777777777778 | 0 |
| 0.7159722222222222 | 0 |
| 0.7166666666666667 | 0 |
| 0.717361111111111 | 0 |
| 0.7180555555555556 | 0 |
| 0.71875 | 0 |
| 0.7194444444444444 | 0 |
| 0.720138888888889 | 0 |
| 0.7208333333333333 | 0 |
| 0.7215277777777778 | 0 |
| 0.7222222222222222 | 0 |
| 0.7229166666666668 | 0 |
| 0.7236111111111111 | 0 |
| 0.7243055555555555 | 0 |
| 0.725 | 0 |
| 0.7256944444444445 | 0 |
| 0.7263888888888889 | 0 |
| 0.7270833333333333 | 0 |
| 0.7277777777777777 | 0 |
| 0.7284722222222223 | 0 |
| 0.7291666666666666 | 0 |
| 0.7298611111111111 | 0 |
| 0.7305555555555556 | 0 |
| 0.7312500000000001 | 0 |
| 0.7319444444444444 | 0 |
| 0.7326388888888888 | 0 |
| 0.7333333333333334 | 0 |
| 0.7340277777777778 | 0 |
| 0.7347222222222222 | 0 |
| 0.7354166666666666 | 0 |
| 0.7361111111111112 | 0 |
| 0.7368055555555556 | 0 |
| 0.7374999999999999 | 0 |
| 0.7381944444444444 | 0 |
| 0.7388888888888889 | 0 |
| 0.7395833333333334 | 0 |
| 0.7402777777777777 | 0 |
| 0.7409722222222223 | 0 |
| 0.7416666666666667 | 0 |
| 0.7423611111111111 | 0 |
| 0.7430555555555555 | 0 |
| 0.74375 | 0 |
| 0.7444444444444445 | 0 |
| 0.7451388888888889 | 0 |
| 0.7458333333333332 | 0 |
| 0.7465277777777778 | 0 |
| 0.7472222222222222 | 0 |
| 0.7479166666666667 | 0 |
| 0.748611111111111 | 0 |
| 0.7493055555555556 | 0 |
| 0.75 | 0 |
| 0.7506944444444444 | 0 |
| 0.751388888888889 | 0 |
| 0.7520833333333333 | 0 |
| 0.7527777777777778 | 0 |
| 0.7534722222222222 | 0 |
| 0.7541666666666668 | 0 |
| 0.7548611111111111 | 0 |
| 0.7555555555555555 | 0 |
| 0.75625 | 0 |
| 0.7569444444444445 | 0 |
| 0.7576388888888889 | 0 |
| 0.7583333333333333 | 0 |
| 0.7590277777777777 | 0 |
| 0.7597222222222223 | 0 |
| 0.7604166666666666 | 0 |
| 0.7611111111111111 | 0 |
| 0.7618055555555556 | 0 |
| 0.7625000000000001 | 0 |
| 0.7631944444444444 | 0 |
| 0.7638888888888888 | 0 |
| 0.7645833333333334 | 0 |
| 0.7652777777777778 | 0 |
| 0.7659722222222222 | 0 |
| 0.7666666666666666 | 0 |
| 0.7673611111111112 | 0 |
| 0.7680555555555556 | 0 |
| 0.7687499999999999 | 0 |
| 0.7694444444444444 | 0 |
| 0.7701388888888889 | 0 |
| 0.7708333333333334 | 0 |
| 0.7715277777777777 | 0 |
| 0.7722222222222223 | 0 |
| 0.7729166666666667 | 0 |
| 0.7736111111111111 | 0 |
| 0.7743055555555555 | 0 |
| 0.775 | 0 |
| 0.7756944444444445 | 0 |
| 0.7763888888888889 | 0 |
| 0.7770833333333332 | 0 |
| 0.7777777777777778 | 0 |
| 0.7784722222222222 | 0 |
| 0.7791666666666667 | 0 |
| 0.779861111111111 | 0 |
| 0.7805555555555556 | 0 |
| 0.78125 | 0 |
| 0.7819444444444444 | 0 |
| 0.782638888888889 | 0 |
| 0.7833333333333333 | 0 |
| 0.7840277777777778 | 0 |
| 0.7847222222222222 | 0 |
| 0.7854166666666668 | 0 |
| 0.7861111111111111 | 0 |
| 0.7868055555555555 | 0 |
| 0.7875 | 0 |
| 0.7881944444444445 | 0 |
| 0.7888888888888889 | 0 |
| 0.7895833333333333 | 0 |
| 0.7902777777777777 | 0 |
| 0.7909722222222223 | 0 |
| 0.7916666666666666 | 0 |
| 0.7923611111111111 | 0 |
| 0.7930555555555556 | 0 |
| 0.7937500000000001 | 0 |
| 0.7944444444444444 | 0 |
| 0.7951388888888888 | 0 |
| 0.7958333333333334 | 0 |
| 0.7965277777777778 | 0 |
| 0.7972222222222222 | 0 |
| 0.7979166666666666 | 0 |
| 0.7986111111111112 | 0 |
| 0.7993055555555556 | 0 |
| 0.7999999999999999 | 0 |
| 0.8006944444444444 | 0 |
| 0.8013888888888889 | 0 |
| 0.8020833333333334 | 0 |
| 0.8027777777777777 | 0 |
| 0.8034722222222223 | 0 |
| 0.8041666666666667 | 0 |
| 0.8048611111111111 | 0 |
| 0.8055555555555555 | 0 |
| 0.80625 | 0 |
| 0.8069444444444445 | 0 |
| 0.8076388888888889 | 0 |
| 0.8083333333333332 | 0 |
| 0.8090277777777778 | 0 |
| 0.8097222222222222 | 0 |
| 0.8104166666666667 | 0 |
| 0.811111111111111 | 0 |
| 0.8118055555555556 | 0 |
| 0.8125 | 0 |
| 0.8131944444444444 | 0 |
| 0.813888888888889 | 0 |
| 0.8145833333333333 | 0 |
| 0.8152777777777778 | 0 |
| 0.8159722222222222 | 0 |
| 0.8166666666666668 | 0 |
| 0.8173611111111111 | 0 |
| 0.8180555555555555 | 0 |
| 0.81875 | 0 |
| 0.8194444444444445 | 0 |
| 0.8201388888888889 | 0 |
| 0.8208333333333333 | 0 |
| 0.8215277777777777 | 0 |
| 0.8222222222222223 | 0 |
| 0.8229166666666666 | 0 |
| 0.8236111111111111 | 0 |
| 0.8243055555555556 | 0 |
| 0.8250000000000001 | 0 |
| 0.8256944444444444 | 0 |
| 0.8263888888888888 | 0 |
| 0.8270833333333334 | 0 |
| 0.8277777777777778 | 0 |
| 0.8284722222222222 | 0 |
| 0.8291666666666666 | 0 |
| 0.8298611111111112 | 0 |
| 0.8305555555555556 | 0 |
| 0.8312499999999999 | 0 |
| 0.8319444444444444 | 0 |
| 0.8326388888888889 | 0 |
| 0.8333333333333334 | 0 |
| 0.8340277777777777 | 0 |
| 0.8347222222222223 | 0 |
| 0.8354166666666667 | 0 |
| 0.8361111111111111 | 0 |
| 0.8368055555555555 | 0 |
| 0.8375 | 0 |
| 0.8381944444444445 | 0 |
| 0.8388888888888889 | 0 |
| 0.8395833333333332 | 0 |
| 0.8402777777777778 | 0 |
| 0.8409722222222222 | 0 |
| 0.8416666666666667 | 0 |
| 0.842361111111111 | 0 |
| 0.8430555555555556 | 0 |
| 0.84375 | 0 |
| 0.8444444444444444 | 0 |
| 0.845138888888889 | 0 |
| 0.8458333333333333 | 0 |
| 0.8465277777777778 | 0 |
| 0.8472222222222222 | 0 |
| 0.8479166666666668 | 0 |
| 0.8486111111111111 | 0 |
| 0.8493055555555555 | 0 |
| 0.85 | 0 |
| 0.8506944444444445 | 0 |
| 0.8513888888888889 | 0 |
| 0.8520833333333333 | 0 |
| 0.8527777777777777 | 0 |
| 0.8534722222222223 | 0 |
| 0.8541666666666666 | 0 |
| 0.8548611111111111 | 0 |
| 0.8555555555555556 | 0 |
| 0.8562500000000001 | 0 |
| 0.8569444444444444 | 0 |
| 0.8576388888888888 | 0 |
| 0.8583333333333334 | 0 |
| 0.8590277777777778 | 0 |
| 0.8597222222222222 | 0 |
| 0.8604166666666666 | 0 |
| 0.8611111111111112 | 0 |
| 0.8618055555555556 | 0 |
| 0.8624999999999999 | 0 |
| 0.8631944444444444 | 0 |
| 0.8638888888888889 | 0 |
| 0.8645833333333334 | 0 |
| 0.8652777777777777 | 0 |
| 0.8659722222222223 | 0 |
| 0.8666666666666667 | 0 |
| 0.8673611111111111 | 0 |
| 0.8680555555555555 | 0 |
| 0.86875 | 0 |
| 0.8694444444444445 | 0 |
| 0.8701388888888889 | 0 |
| 0.8708333333333332 | 0 |
| 0.8715277777777778 | 0 |
| 0.8722222222222222 | 0 |
| 0.8729166666666667 | 0 |
| 0.873611111111111 | 0 |
| 0.8743055555555556 | 0 |
| 0.875 | 0 |
| 0.8756944444444444 | 0 |
| 0.876388888888889 | 0 |
| 0.8770833333333333 | 0 |
| 0.8777777777777778 | 0 |
| 0.8784722222222222 | 0 |
| 0.8791666666666668 | 0 |
| 0.8798611111111111 | 0 |
| 0.8805555555555555 | 0 |
| 0.88125 | 0 |
| 0.8819444444444445 | 0 |
| 0.8826388888888889 | 0 |
| 0.8833333333333333 | 0 |
| 0.8840277777777777 | 0 |
| 0.8847222222222223 | 0 |
| 0.8854166666666666 | 0 |
| 0.8861111111111111 | 0 |
| 0.8868055555555556 | 0 |
| 0.8875000000000001 | 0 |
| 0.8881944444444444 | 0 |
| 0.8888888888888888 | 0 |
| 0.8895833333333334 | 0 |
| 0.8902777777777778 | 0 |
| 0.8909722222222222 | 0 |
| 0.8916666666666666 | 0 |
| 0.8923611111111112 | 0 |
| 0.8930555555555556 | 0 |
| 0.8937499999999999 | 0 |
| 0.8944444444444444 | 0 |
| 0.8951388888888889 | 0 |
| 0.8958333333333334 | 0 |
| 0.8965277777777777 | 0 |
| 0.8972222222222223 | 0 |
| 0.8979166666666667 | 0 |
| 0.8986111111111111 | 0 |
| 0.8993055555555555 | 0 |
| 0.9 | 0 |
| 0.9006944444444445 | 0 |
| 0.9013888888888889 | 0 |
| 0.9020833333333332 | 0 |
| 0.9027777777777778 | 0 |
| 0.9034722222222222 | 0 |
| 0.9041666666666667 | 0 |
| 0.904861111111111 | 0 |
| 0.9055555555555556 | 0 |
| 0.90625 | 0 |
| 0.9069444444444444 | 0 |
| 0.907638888888889 | 0 |
| 0.9083333333333333 | 0 |
| 0.9090277777777778 | 0 |
| 0.9097222222222222 | 0 |
| 0.9104166666666668 | 0 |
| 0.9111111111111111 | 0 |
| 0.9118055555555555 | 0 |
| 0.9125 | 0 |
| 0.9131944444444445 | 0 |
| 0.9138888888888889 | 0 |
| 0.9145833333333333 | 0 |
| 0.9152777777777777 | 0 |
| 0.9159722222222223 | 0 |
| 0.9166666666666666 | 0 |
| 0.9173611111111111 | 0 |
| 0.9180555555555556 | 0 |
| 0.9187500000000001 | 0 |
| 0.9194444444444444 | 0 |
| 0.9201388888888888 | 0 |
| 0.9208333333333334 | 0 |
| 0.9215277777777778 | 0 |
| 0.9222222222222222 | 0 |
| 0.9229166666666666 | 0 |
| 0.9236111111111112 | 0 |
| 0.9243055555555556 | 0 |
| 0.9249999999999999 | 0 |
| 0.9256944444444444 | 0 |
| 0.9263888888888889 | 0 |
| 0.9270833333333334 | 0 |
| 0.9277777777777777 | 0 |
| 0.9284722222222223 | 0 |
| 0.9291666666666667 | 0 |
| 0.9298611111111111 | 0 |
| 0.9305555555555555 | 0 |
| 0.93125 | 0 |
| 0.9319444444444445 | 0 |
| 0.9326388888888889 | 0 |
| 0.9333333333333332 | 0 |
| 0.9340277777777778 | 0 |
| 0.9347222222222222 | 0 |
| 0.9354166666666667 | 0 |
| 0.936111111111111 | 0 |
| 0.9368055555555556 | 0 |
| 0.9375 | 0 |
| 0.9381944444444444 | 0 |
| 0.938888888888889 | 0 |
| 0.9395833333333333 | 0 |
| 0.9402777777777778 | 0 |
| 0.9409722222222222 | 0 |
| 0.9416666666666668 | 0 |
| 0.9423611111111111 | 0 |
| 0.9430555555555555 | 0 |
| 0.94375 | 0 |
| 0.9444444444444445 | 0 |
| 0.9451388888888889 | 0 |
| 0.9458333333333333 | 0 |
| 0.9465277777777777 | 0 |
| 0.9472222222222223 | 0 |
| 0.9479166666666666 | 0 |
| 0.9486111111111111 | 0 |
| 0.9493055555555556 | 0 |
| 0.9500000000000001 | 0 |
| 0.9506944444444444 | 0 |
| 0.9513888888888888 | 0 |
| 0.9520833333333334 | 0 |
| 0.9527777777777778 | 0 |
| 0.9534722222222222 | 0 |
| 0.9541666666666666 | 0 |
| 0.9548611111111112 | 0 |
| 0.9555555555555556 | 0 |
| 0.9562499999999999 | 0 |
| 0.9569444444444444 | 0 |
| 0.9576388888888889 | 0 |
| 0.9583333333333334 | 0 |
| 0.9590277777777777 | 0 |
| 0.9597222222222223 | 0 |
| 0.9604166666666667 | 0 |
| 0.9611111111111111 | 0 |
| 0.9618055555555555 | 0 |
| 0.9625 | 0 |
| 0.9631944444444445 | 0 |
| 0.9638888888888889 | 0 |
| 0.9645833333333332 | 0 |
| 0.9652777777777778 | 0 |
| 0.9659722222222222 | 0 |
| 0.9666666666666667 | 0 |
| 0.967361111111111 | 0 |
| 0.9680555555555556 | 0 |
| 0.96875 | 0 |
| 0.9694444444444444 | 0 |
| 0.970138888888889 | 0 |
| 0.9708333333333333 | 0 |
| 0.9715277777777778 | 0 |
| 0.9722222222222222 | 0 |
| 0.9729166666666668 | 0 |
| 0.9736111111111111 | 0 |
| 0.9743055555555555 | 0 |
| 0.975 | 0 |
| 0.9756944444444445 | 0 |
| 0.9763888888888889 | 0 |
| 0.9770833333333333 | 0 |
| 0.9777777777777777 | 0 |
| 0.9784722222222223 | 0 |
| 0.9791666666666666 | 0 |
| 0.9798611111111111 | 0 |
| 0.9805555555555556 | 0 |
| 0.9812500000000001 | 0 |
| 0.9819444444444444 | 0 |
| 0.9826388888888888 | 0 |
| 0.9833333333333334 | 0 |
| 0.9840277777777778 | 0 |
| 0.9847222222222222 | 0 |
| 0.9854166666666666 | 0 |
| 0.9861111111111112 | 0 |
| 0.9868055555555556 | 0 |
| 0.9874999999999999 | 0 |
| 0.9881944444444444 | 0 |
| 0.9888888888888889 | 0 |
| 0.9895833333333334 | 0 |
| 0.9902777777777777 | 0 |
| 0.9909722222222223 | 0 |
| 0.9916666666666667 | 0 |
| 0.9923611111111111 | 0 |
| 0.9930555555555555 | 0 |
| 0.99375 | 0 |
| 0.9944444444444445 | 0 |
| 0.9951388888888889 | 0 |
| 0.9958333333333332 | 0 |
| 0.9965277777777778 | 0 |
| 0.9972222222222222 | 0 |
| 0.9979166666666667 | 0 |
| 0.998611111111111 | 0 |
| 0.9993055555555556 | 0 |